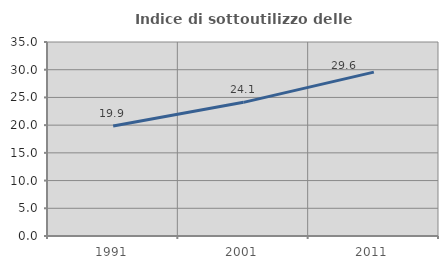
| Category | Indice di sottoutilizzo delle abitazioni  |
|---|---|
| 1991.0 | 19.85 |
| 2001.0 | 24.114 |
| 2011.0 | 29.566 |